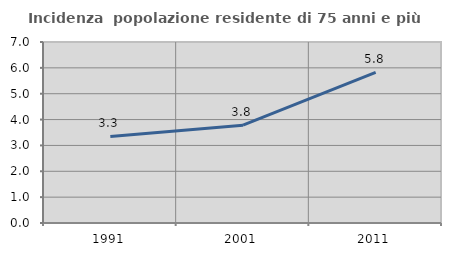
| Category | Incidenza  popolazione residente di 75 anni e più |
|---|---|
| 1991.0 | 3.347 |
| 2001.0 | 3.782 |
| 2011.0 | 5.827 |